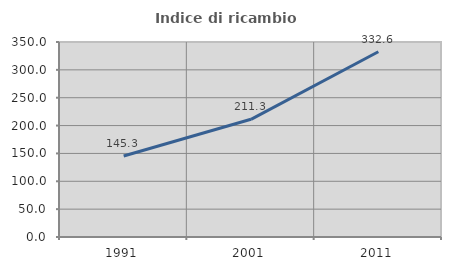
| Category | Indice di ricambio occupazionale  |
|---|---|
| 1991.0 | 145.31 |
| 2001.0 | 211.256 |
| 2011.0 | 332.558 |